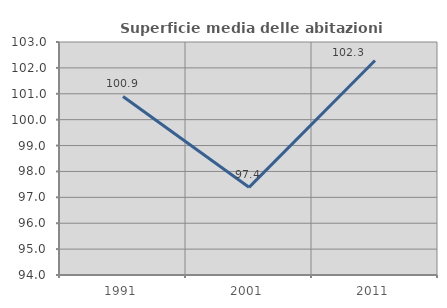
| Category | Superficie media delle abitazioni occupate |
|---|---|
| 1991.0 | 100.897 |
| 2001.0 | 97.386 |
| 2011.0 | 102.283 |